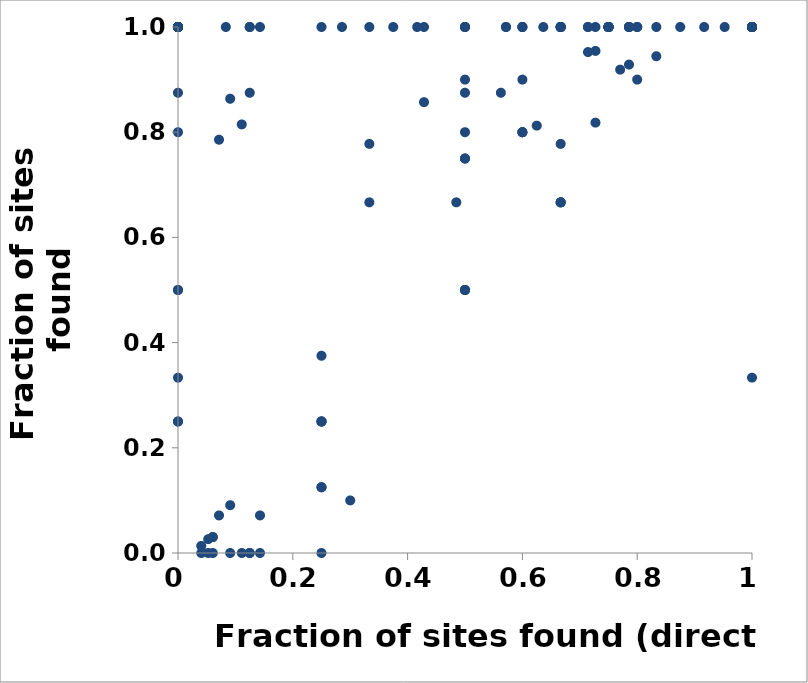
| Category | Direct Methods |
|---|---|
| 0.0 | 1 |
| 1.0 | 1 |
| 0.0 | 1 |
| 0.0 | 1 |
| 1.0 | 1 |
| 1.0 | 1 |
| 1.0 | 1 |
| 0.0 | 0.333 |
| 0.666666666666667 | 0.667 |
| 0.333333333333333 | 0.667 |
| 0.666666666666667 | 0.667 |
| 0.0 | 1 |
| 0.333333333333333 | 1 |
| 0.0 | 1 |
| 1.0 | 1 |
| 0.666666666666667 | 1 |
| 0.666666666666667 | 1 |
| 1.0 | 1 |
| 0.666666666666667 | 1 |
| 1.0 | 1 |
| 0.666666666666667 | 1 |
| 0.666666666666667 | 1 |
| 0.666666666666667 | 1 |
| 0.25 | 0 |
| 0.0 | 0.25 |
| 0.25 | 0.25 |
| 0.25 | 0.25 |
| 0.0 | 0.25 |
| 0.5 | 0.5 |
| 0.5 | 0.5 |
| 0.5 | 0.5 |
| 0.5 | 0.75 |
| 0.5 | 0.75 |
| 0.0 | 1 |
| 0.75 | 1 |
| 1.0 | 1 |
| 1.0 | 1 |
| 0.75 | 1 |
| 0.25 | 1 |
| 1.0 | 1 |
| 0.5 | 1 |
| 1.0 | 1 |
| 0.75 | 1 |
| 1.0 | 1 |
| 1.0 | 1 |
| 1.0 | 1 |
| 1.0 | 1 |
| 1.0 | 1 |
| 0.75 | 1 |
| 0.0 | 0.8 |
| 0.6 | 0.8 |
| 0.6 | 0.8 |
| 0.0 | 1 |
| 0.6 | 1 |
| 0.6 | 1 |
| 0.8 | 1 |
| 1.0 | 1 |
| 0.8 | 1 |
| 0.0 | 1 |
| 0.0 | 1 |
| 0.6 | 1 |
| 1.0 | 1 |
| 1.0 | 1 |
| 1.0 | 1 |
| 1.0 | 0.333 |
| 1.0 | 1 |
| 1.0 | 1 |
| 1.0 | 1 |
| 1.0 | 1 |
| 1.0 | 1 |
| 1.0 | 1 |
| 1.0 | 1 |
| 1.0 | 1 |
| 1.0 | 1 |
| 1.0 | 1 |
| 0.142857142857143 | 0 |
| 0.571428571428571 | 1 |
| 0.142857142857143 | 1 |
| 0.571428571428571 | 1 |
| 0.285714285714286 | 1 |
| 0.428571428571429 | 1 |
| 0.125 | 0 |
| 0.125 | 0 |
| 0.25 | 0.125 |
| 0.25 | 0.125 |
| 0.25 | 0.25 |
| 0.25 | 0.375 |
| 1.0 | 1 |
| 0.0 | 0.5 |
| 0.0 | 0.875 |
| 0.5 | 0.875 |
| 0.125 | 1 |
| 0.375 | 1 |
| 0.0 | 1 |
| 0.0 | 1 |
| 1.0 | 1 |
| 0.0 | 1 |
| 0.5 | 1 |
| 0.0 | 1 |
| 0.125 | 1 |
| 0.0 | 1 |
| 0.875 | 1 |
| 1.0 | 1 |
| 0.0 | 1 |
| 0.75 | 1 |
| 0.0 | 1 |
| 0.666666666666667 | 0.667 |
| 0.666666666666667 | 0.778 |
| 0.666666666666667 | 1 |
| 0.3 | 0.1 |
| 0.0 | 0.5 |
| 0.5 | 0.8 |
| 0.6 | 0.8 |
| 0.5 | 0.9 |
| 0.6 | 0.9 |
| 0.8 | 0.9 |
| 0.5 | 1 |
| 0.0909090909090909 | 0 |
| 0.0909090909090909 | 0.091 |
| 0.727272727272727 | 0.818 |
| 0.636363636363636 | 1 |
| 0.727272727272727 | 1 |
| 0.916666666666667 | 1 |
| 0.75 | 1 |
| 0.75 | 1 |
| 0.0833333333333333 | 1 |
| 0.416666666666667 | 1 |
| 0.75 | 1 |
| 0.75 | 1 |
| 0.142857142857143 | 0.071 |
| 0.0714285714285714 | 0.071 |
| 0.0714285714285714 | 0.786 |
| 0.428571428571429 | 0.857 |
| 0.785714285714286 | 0.929 |
| 0.714285714285714 | 1 |
| 0.785714285714286 | 1 |
| 0.714285714285714 | 1 |
| 0.785714285714286 | 1 |
| 0.785714285714286 | 1 |
| 0.785714285714286 | 1 |
| 0.625 | 0.812 |
| 0.125 | 0.875 |
| 0.5625 | 0.875 |
| 0.75 | 1 |
| 0.833333333333333 | 0.944 |
| 0.833333333333333 | 1 |
| 0.714285714285714 | 0.952 |
| 0.952380952380952 | 1 |
| 0.0909090909090909 | 0.864 |
| 0.727272727272727 | 0.955 |
| 0.111111111111111 | 0 |
| 0.333333333333333 | 0.778 |
| 0.111111111111111 | 0.815 |
| 0.0606060606060606 | 0.03 |
| 0.0606060606060606 | 0.03 |
| 0.484848484848485 | 0.667 |
| 0.0526315789473684 | 0 |
| 0.0526315789473684 | 0.026 |
| 0.0606060606060606 | 0 |
| 0.0405405405405405 | 0 |
| 0.0405405405405405 | 0.014 |
| 0.77027027027027 | 0.919 |